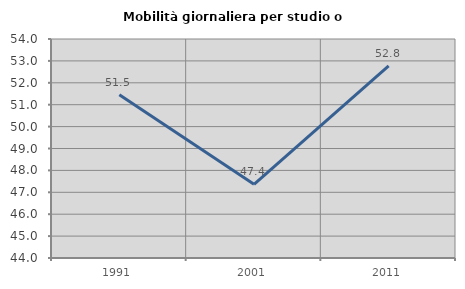
| Category | Mobilità giornaliera per studio o lavoro |
|---|---|
| 1991.0 | 51.452 |
| 2001.0 | 47.363 |
| 2011.0 | 52.771 |